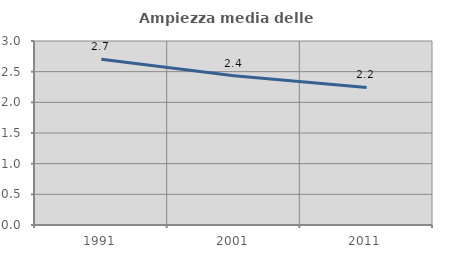
| Category | Ampiezza media delle famiglie |
|---|---|
| 1991.0 | 2.702 |
| 2001.0 | 2.432 |
| 2011.0 | 2.242 |